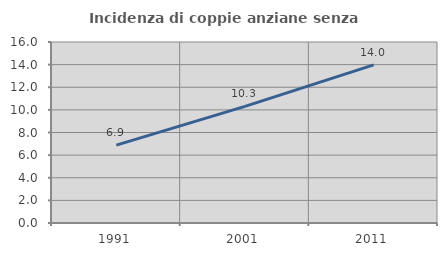
| Category | Incidenza di coppie anziane senza figli  |
|---|---|
| 1991.0 | 6.887 |
| 2001.0 | 10.314 |
| 2011.0 | 13.975 |